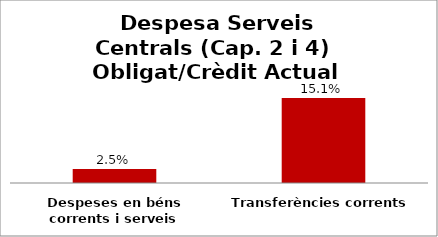
| Category | Series 0 |
|---|---|
| Despeses en béns corrents i serveis | 0.025 |
| Transferències corrents | 0.151 |